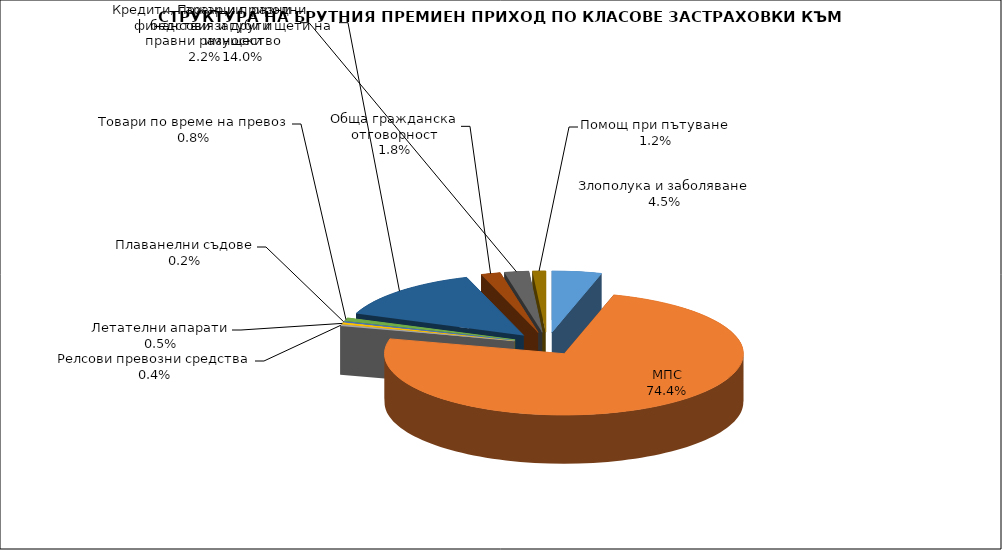
| Category | Злополука и заболяване |
|---|---|
| Злополука и заболяване | 0.045 |
| МПС | 0.744 |
| Релсови превозни средства | 0.004 |
| Летателни апарати | 0.005 |
| Плаванелни съдове | 0.002 |
| Товари по време на превоз | 0.008 |
| Пожар и природни бедствия и други щети на имущество | 0.14 |
| Обща гражданска отговорност | 0.018 |
| Кредити, гаранции, разни финансови загуби и правни разноски | 0.022 |
| Помощ при пътуване | 0.012 |